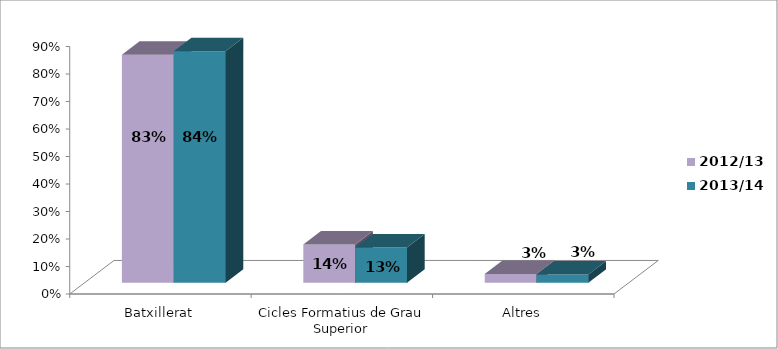
| Category | 2012/13 | 2013/14 |
|---|---|---|
| Batxillerat | 0.829 | 0.842 |
| Cicles Formatius de Grau Superior | 0.139 | 0.128 |
| Altres | 0.032 | 0.03 |